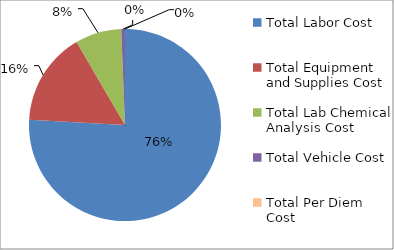
| Category | Series 0 |
|---|---|
| Total Labor Cost | 66946.771 |
| Total Equipment and Supplies Cost | 13891.3 |
| Total Lab Chemical Analysis Cost | 6864 |
| Total Vehicle Cost | 557.161 |
| Total Per Diem Cost | 0 |